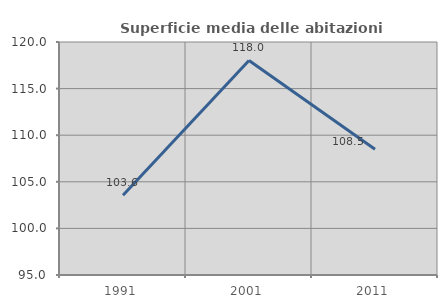
| Category | Superficie media delle abitazioni occupate |
|---|---|
| 1991.0 | 103.551 |
| 2001.0 | 118.02 |
| 2011.0 | 108.49 |